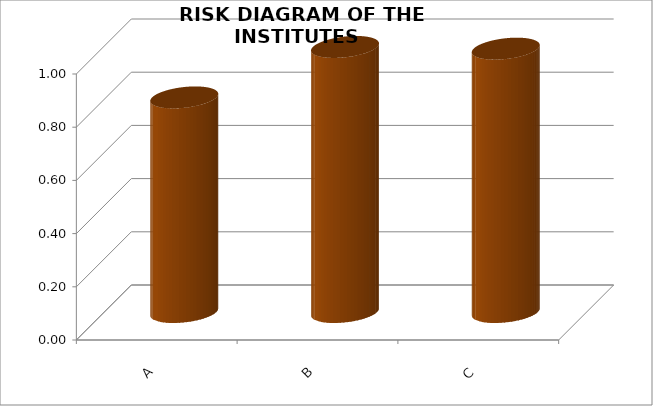
| Category | Series 0 |
|---|---|
| A | 0.807 |
| B | 0.996 |
| C | 0.99 |